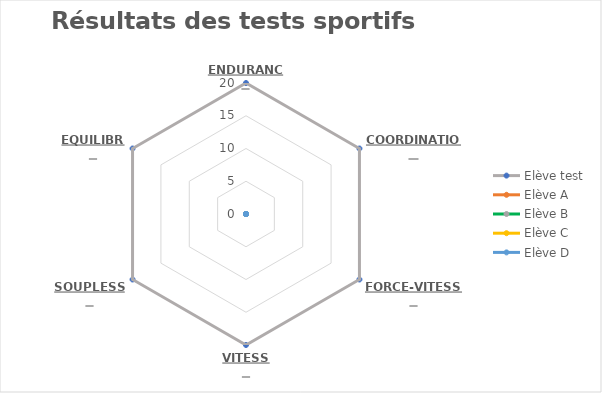
| Category | Elève test | Elève A | Elève B | Elève C | Elève D |
|---|---|---|---|---|---|
| ENDURANCE | 20 | 0 | 0 | 0 | 0 |
| COORDINATION | 20 | 0 | 0 | 0 | 0 |
| FORCE-VITESSE | 20 | 0 | 0 | 0 | 0 |
| VITESSE | 20 | 0 | 0 | 0 | 0 |
| SOUPLESSE | 20 | 0 | 0 | 0 | 0 |
| EQUILIBRE | 20 | 0 | 0 | 0 | 0 |